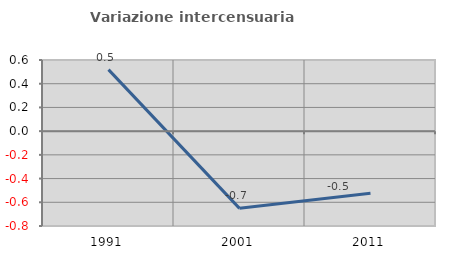
| Category | Variazione intercensuaria annua |
|---|---|
| 1991.0 | 0.519 |
| 2001.0 | -0.651 |
| 2011.0 | -0.523 |